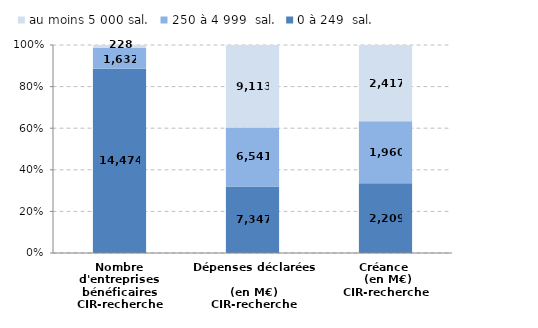
| Category | 0 à 249  sal. | 250 à 4 999  sal. | au moins 5 000 sal. |
|---|---|---|---|
| Nombre d'entreprises bénéficaires
CIR-recherche | 14474 | 1632 | 228 |
| Dépenses déclarées 
(en M€)
CIR-recherche | 7347.41 | 6541.2 | 9113.12 |
| Créance 
 (en M€)
CIR-recherche | 2208.68 | 1960.01 | 2416.67 |